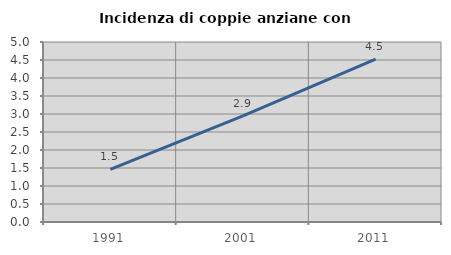
| Category | Incidenza di coppie anziane con figli |
|---|---|
| 1991.0 | 1.461 |
| 2001.0 | 2.946 |
| 2011.0 | 4.525 |